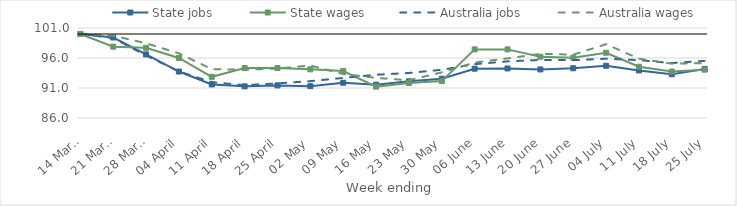
| Category | State jobs | State wages | Australia jobs | Australia wages |
|---|---|---|---|---|
| 2020-03-14 | 100 | 100 | 100 | 100 |
| 2020-03-21 | 99.411 | 97.89 | 99.322 | 99.708 |
| 2020-03-28 | 96.601 | 97.699 | 96.426 | 98.464 |
| 2020-04-04 | 93.743 | 96 | 93.761 | 96.774 |
| 2020-04-11 | 91.593 | 92.865 | 91.978 | 94.155 |
| 2020-04-18 | 91.274 | 94.334 | 91.464 | 94.034 |
| 2020-04-25 | 91.434 | 94.326 | 91.766 | 94.248 |
| 2020-05-02 | 91.305 | 94.11 | 92.148 | 94.747 |
| 2020-05-09 | 91.88 | 93.817 | 92.676 | 93.34 |
| 2020-05-16 | 91.559 | 91.226 | 93.207 | 92.686 |
| 2020-05-23 | 92.116 | 91.837 | 93.505 | 92.29 |
| 2020-05-30 | 92.548 | 92.149 | 94.037 | 93.611 |
| 2020-06-06 | 94.219 | 97.436 | 94.972 | 95.238 |
| 2020-06-13 | 94.257 | 97.434 | 95.44 | 95.935 |
| 2020-06-20 | 94.095 | 96.208 | 95.683 | 96.696 |
| 2020-06-27 | 94.291 | 96.059 | 95.641 | 96.56 |
| 2020-07-04 | 94.706 | 96.88 | 95.882 | 98.301 |
| 2020-07-11 | 93.924 | 94.537 | 95.648 | 95.883 |
| 2020-07-18 | 93.287 | 93.744 | 95.158 | 95.058 |
| 2020-07-25 | 94.183 | 94.055 | 95.522 | 95.15 |